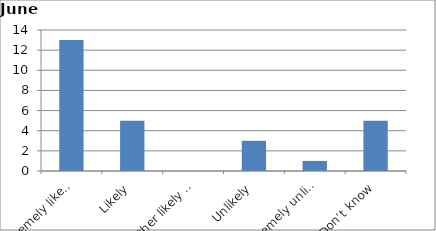
| Category | Series 0 |
|---|---|
| Extremely likely | 13 |
| Likely | 5 |
| Neither likely nor unlikely | 0 |
| Unlikely | 3 |
| Extremely unlikely | 1 |
| Don’t know | 5 |